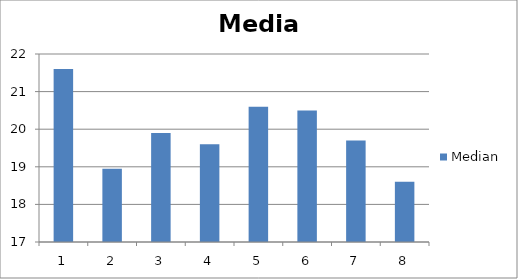
| Category | Median |
|---|---|
| 0 | 21.6 |
| 1 | 18.95 |
| 2 | 19.9 |
| 3 | 19.6 |
| 4 | 20.6 |
| 5 | 20.5 |
| 6 | 19.7 |
| 7 | 18.6 |